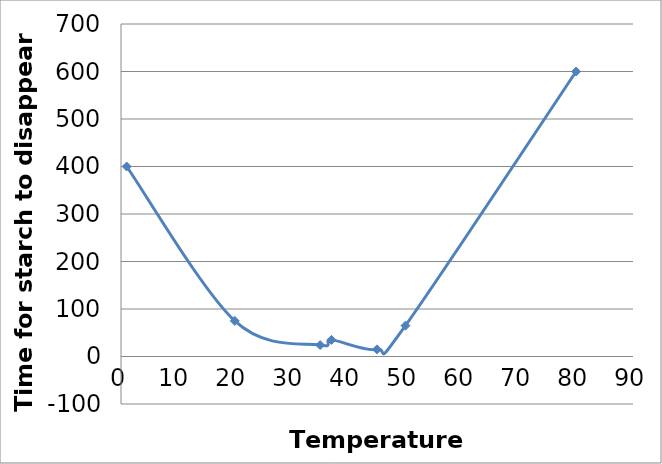
| Category | Time for starch to disappear (s) |
|---|---|
| 1.0 | 400 |
| 20.0 | 75 |
| 35.0 | 24 |
| 37.0 | 35 |
| 45.0 | 15 |
| 50.0 | 65 |
| 80.0 | 600 |